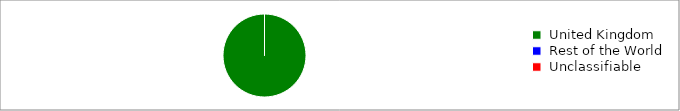
| Category | Series 0 |
|---|---|
|  United Kingdom  | 10158 |
|  Rest of the World  | 0 |
|  Unclassifiable  | 0 |